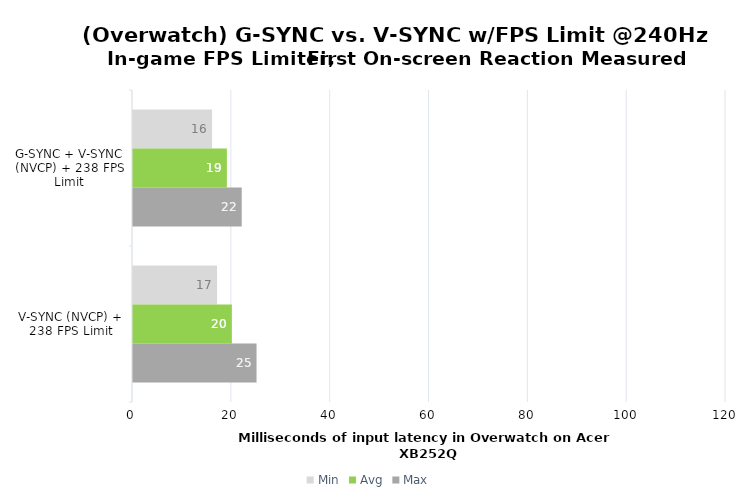
| Category | Min | Avg | Max |
|---|---|---|---|
| G-SYNC + V-SYNC (NVCP) + 238 FPS Limit | 16 | 19 | 22 |
| V-SYNC (NVCP) + 238 FPS Limit | 17 | 20 | 25 |